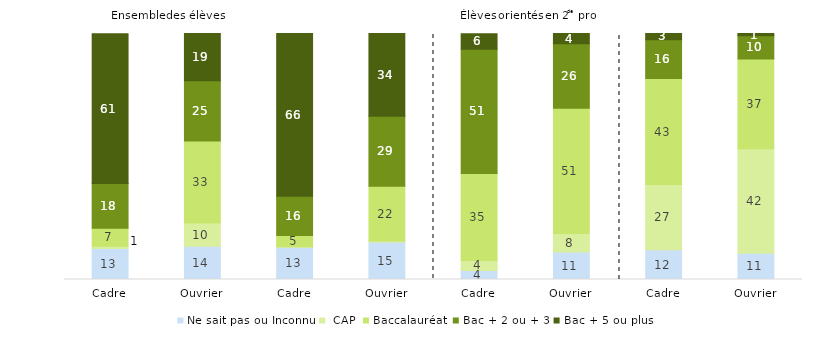
| Category | Ne sait pas ou Inconnu |  CAP | Baccalauréat | Bac + 2 ou + 3 | Bac + 5 ou plus |
|---|---|---|---|---|---|
| Cadre | 12.6 | 0.9 | 7.3 | 18.2 | 60.9 |
| Ouvrier | 13.5 | 9.5 | 33.3 | 24.5 | 19.2 |
| Cadre | 13.1 | 0.2 | 4.6 | 15.9 | 66.2 |
| Ouvrier | 15.2 | 0.4 | 22.3 | 28.5 | 33.6 |
| Cadre | 3.7 | 4 | 35.4 | 50.5 | 6.3 |
| Ouvrier | 11.2 | 7.5 | 50.9 | 26.2 | 4.2 |
| Cadre | 12.1 | 26.5 | 43.1 | 15.8 | 2.6 |
| Ouvrier | 10.7 | 42.4 | 36.5 | 9.5 | 0.9 |